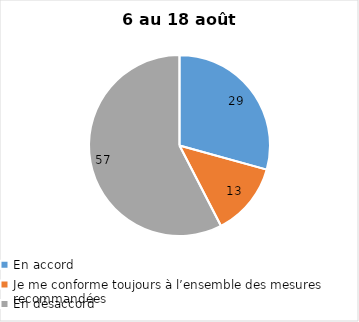
| Category | Series 0 |
|---|---|
| En accord | 29 |
| Je me conforme toujours à l’ensemble des mesures recommandées | 13 |
| En désaccord | 57 |